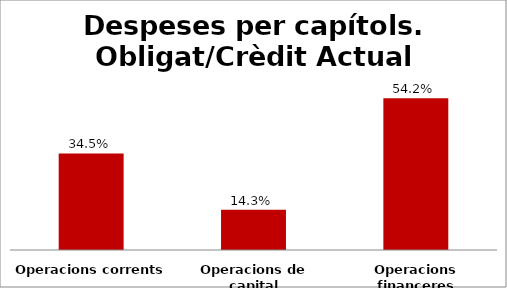
| Category | Series 0 |
|---|---|
| Operacions corrents | 0.345 |
| Operacions de capital | 0.143 |
| Operacions financeres | 0.542 |